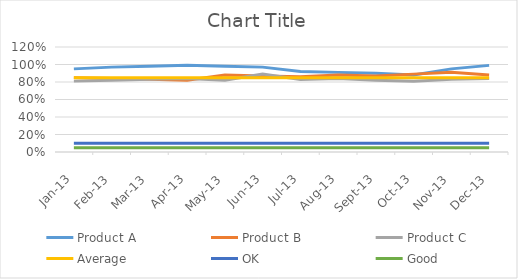
| Category | Product A | Product B | Product C | Average | OK | Good |
|---|---|---|---|---|---|---|
| 2013-01-01 | 0.95 | 0.85 | 0.81 | 0.85 | 0.1 | 0.05 |
| 2013-02-01 | 0.97 | 0.84 | 0.82 | 0.85 | 0.1 | 0.05 |
| 2013-03-01 | 0.98 | 0.83 | 0.83 | 0.85 | 0.1 | 0.05 |
| 2013-04-01 | 0.99 | 0.82 | 0.84 | 0.85 | 0.1 | 0.05 |
| 2013-05-01 | 0.98 | 0.88 | 0.82 | 0.85 | 0.1 | 0.05 |
| 2013-06-01 | 0.97 | 0.87 | 0.89 | 0.85 | 0.1 | 0.05 |
| 2013-07-01 | 0.92 | 0.86 | 0.83 | 0.85 | 0.1 | 0.05 |
| 2013-08-01 | 0.91 | 0.88 | 0.84 | 0.85 | 0.1 | 0.05 |
| 2013-09-01 | 0.9 | 0.87 | 0.82 | 0.85 | 0.1 | 0.05 |
| 2013-10-01 | 0.88 | 0.89 | 0.81 | 0.85 | 0.1 | 0.05 |
| 2013-11-01 | 0.95 | 0.91 | 0.83 | 0.85 | 0.1 | 0.05 |
| 2013-12-01 | 0.99 | 0.88 | 0.84 | 0.85 | 0.1 | 0.05 |